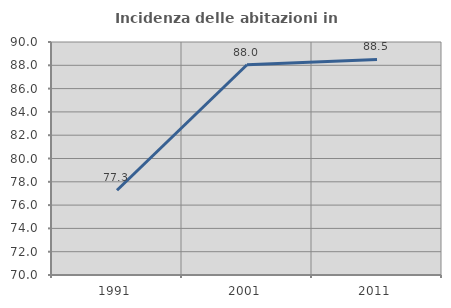
| Category | Incidenza delle abitazioni in proprietà  |
|---|---|
| 1991.0 | 77.273 |
| 2001.0 | 88.043 |
| 2011.0 | 88.506 |